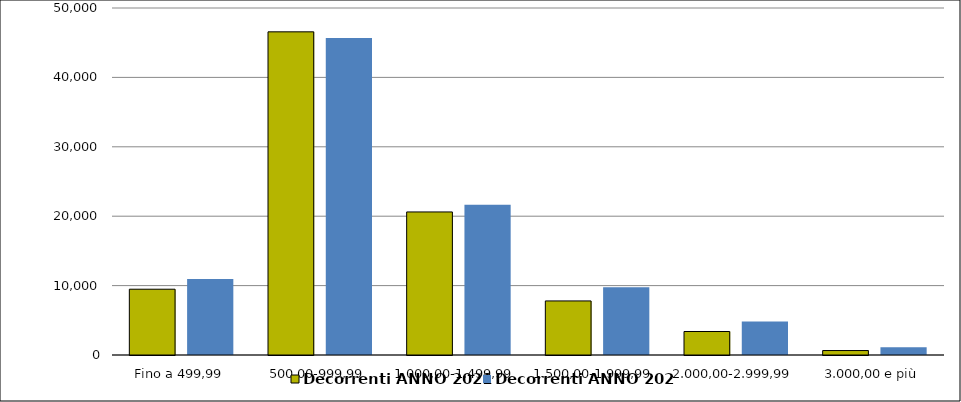
| Category | Decorrenti ANNO 2021 | Decorrenti ANNO 2020 |
|---|---|---|
|  Fino a 499,99  | 9479 | 10939 |
|  500,00-999,99  | 46566 | 45676 |
|  1.000,00-1.499,99  | 20614 | 21664 |
|  1.500,00-1.999,99  | 7792 | 9770 |
|  2.000,00-2.999,99  | 3384 | 4814 |
|  3.000,00 e più  | 642 | 1107 |